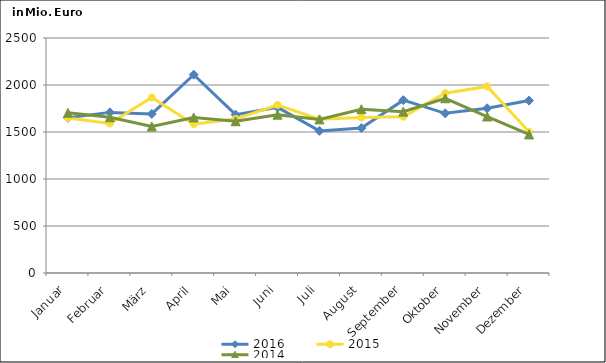
| Category | 2016 | 2015 | 2014 |
|---|---|---|---|
| Januar | 1650.879 | 1649.554 | 1704.053 |
| Februar | 1708.645 | 1590.268 | 1656.484 |
| März | 1692.271 | 1866.664 | 1558.399 |
| April | 2109.648 | 1582.798 | 1654.604 |
| Mai | 1684.742 | 1639.924 | 1614.266 |
| Juni | 1761.976 | 1786.893 | 1683.936 |
| Juli | 1511.726 | 1635.183 | 1634.249 |
| August | 1541.385 | 1655.404 | 1742.811 |
| September | 1838.624 | 1662.606 | 1716.646 |
| Oktober | 1698.524 | 1913.109 | 1858.769 |
| November | 1752.059 | 1984.938 | 1664.745 |
| Dezember | 1834.063 | 1501.624 | 1474 |